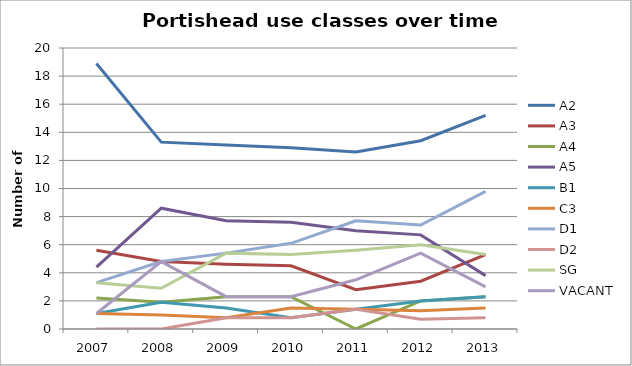
| Category | A2 | A3 | A4 | A5 | B1 | C3 | D1 | D2 | SG | VACANT |
|---|---|---|---|---|---|---|---|---|---|---|
| 2007.0 | 18.9 | 5.6 | 2.2 | 4.4 | 1.1 | 1.1 | 3.3 | 0 | 3.3 | 1.1 |
| 2008.0 | 13.3 | 4.8 | 1.9 | 8.6 | 1.9 | 1 | 4.8 | 0 | 2.9 | 4.8 |
| 2009.0 | 13.1 | 4.6 | 2.3 | 7.7 | 1.5 | 0.8 | 5.4 | 0.8 | 5.4 | 2.3 |
| 2010.0 | 12.9 | 4.5 | 2.3 | 7.6 | 0.8 | 1.5 | 6.1 | 0.8 | 5.3 | 2.3 |
| 2011.0 | 12.6 | 2.8 | 0 | 7 | 1.4 | 1.4 | 7.7 | 1.4 | 5.6 | 3.5 |
| 2012.0 | 13.4 | 3.4 | 2 | 6.7 | 2 | 1.3 | 7.4 | 0.7 | 6 | 5.4 |
| 2013.0 | 15.2 | 5.3 | 2.3 | 3.8 | 2.3 | 1.5 | 9.8 | 0.8 | 5.3 | 3 |